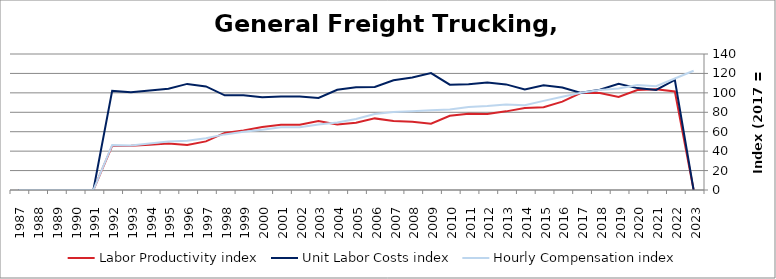
| Category | Labor Productivity index | Unit Labor Costs index | Hourly Compensation index |
|---|---|---|---|
| 2023.0 | 0 | 0 | 122.732 |
| 2022.0 | 101.382 | 113.251 | 114.816 |
| 2021.0 | 103.717 | 103.017 | 106.846 |
| 2020.0 | 102.973 | 104.889 | 108.007 |
| 2019.0 | 95.727 | 109.24 | 104.571 |
| 2018.0 | 99.77 | 103.244 | 103.007 |
| 2017.0 | 100 | 100 | 100 |
| 2016.0 | 90.974 | 105.557 | 96.029 |
| 2015.0 | 85.156 | 107.755 | 91.76 |
| 2014.0 | 84.35 | 103.532 | 87.329 |
| 2013.0 | 80.952 | 108.709 | 88.002 |
| 2012.0 | 78.222 | 110.62 | 86.529 |
| 2011.0 | 78.542 | 108.893 | 85.528 |
| 2010.0 | 76.441 | 108.392 | 82.856 |
| 2009.0 | 68.317 | 120.322 | 82.201 |
| 2008.0 | 70.153 | 115.724 | 81.184 |
| 2007.0 | 71.057 | 113.031 | 80.316 |
| 2006.0 | 73.718 | 106.036 | 78.168 |
| 2005.0 | 69.241 | 105.706 | 73.192 |
| 2004.0 | 67.408 | 103.116 | 69.509 |
| 2003.0 | 71.095 | 94.738 | 67.354 |
| 2002.0 | 67.151 | 96.144 | 64.562 |
| 2001.0 | 67.206 | 96.129 | 64.605 |
| 2000.0 | 64.907 | 95.406 | 61.926 |
| 1999.0 | 61.351 | 97.645 | 59.907 |
| 1998.0 | 58.717 | 97.494 | 57.245 |
| 1997.0 | 50.026 | 106.62 | 53.338 |
| 1996.0 | 46.34 | 109.227 | 50.615 |
| 1995.0 | 47.907 | 104.23 | 49.934 |
| 1994.0 | 46.616 | 102.464 | 47.765 |
| 1993.0 | 45.591 | 100.548 | 45.841 |
| 1992.0 | 45.352 | 102 | 46.259 |
| 1991.0 | 0 | 0 | 0 |
| 1990.0 | 0 | 0 | 0 |
| 1989.0 | 0 | 0 | 0 |
| 1988.0 | 0 | 0 | 0 |
| 1987.0 | 0 | 0 | 0 |